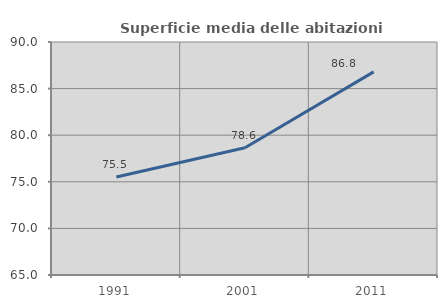
| Category | Superficie media delle abitazioni occupate |
|---|---|
| 1991.0 | 75.519 |
| 2001.0 | 78.646 |
| 2011.0 | 86.793 |